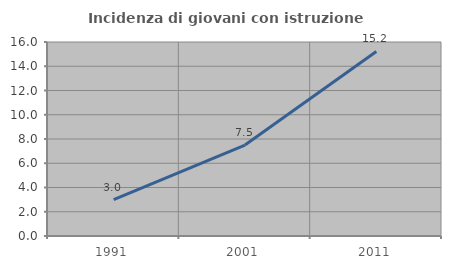
| Category | Incidenza di giovani con istruzione universitaria |
|---|---|
| 1991.0 | 3 |
| 2001.0 | 7.5 |
| 2011.0 | 15.217 |